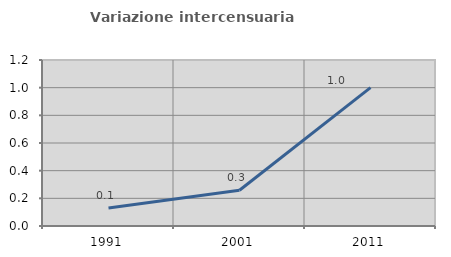
| Category | Variazione intercensuaria annua |
|---|---|
| 1991.0 | 0.13 |
| 2001.0 | 0.259 |
| 2011.0 | 1.001 |